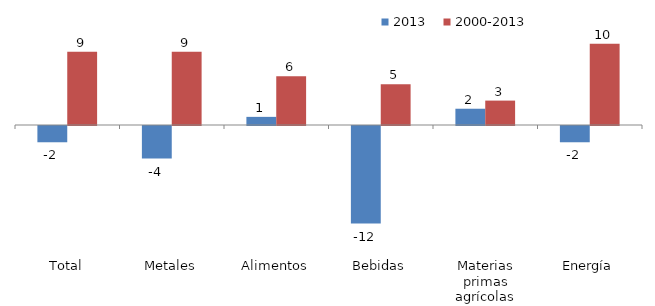
| Category | 2013 | 2000-2013 |
|---|---|---|
| Total | -2 | 9 |
| Metales | -4 | 9 |
| Alimentos | 1 | 6 |
| Bebidas | -12 | 5 |
| Materias primas agrícolas | 2 | 3 |
| Energía | -2 | 10 |